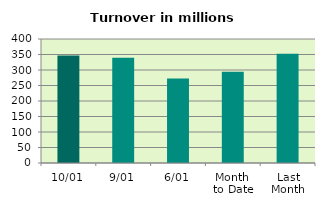
| Category | Series 0 |
|---|---|
| 10/01 | 346.617 |
| 9/01 | 339.767 |
| 6/01 | 272.49 |
| Month 
to Date | 294.619 |
| Last
Month | 352.227 |